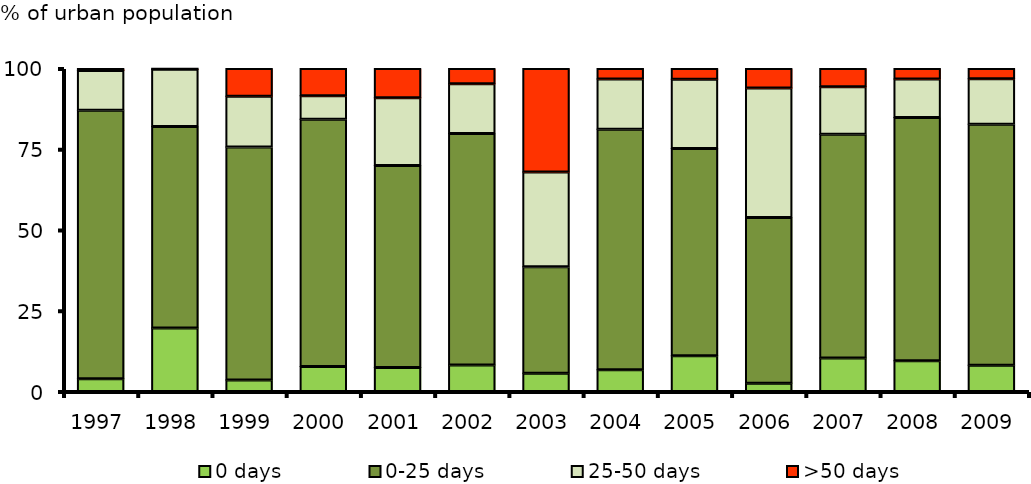
| Category | 0 days | 0-25 days | 25-50 days | >50 days |
|---|---|---|---|---|
| 1997.0 | 3.91 | 83.179 | 12.277 | 0.634 |
| 1998.0 | 19.625 | 62.437 | 17.68 | 0.258 |
| 1999.0 | 3.564 | 72.156 | 15.67 | 8.61 |
| 2000.0 | 7.735 | 76.584 | 7.252 | 8.43 |
| 2001.0 | 7.439 | 62.548 | 20.926 | 9.087 |
| 2002.0 | 8.177 | 71.715 | 15.366 | 4.742 |
| 2003.0 | 5.612 | 33.049 | 29.332 | 32.007 |
| 2004.0 | 6.725 | 74.486 | 15.522 | 3.267 |
| 2005.0 | 11.041 | 64.188 | 21.458 | 3.313 |
| 2006.0 | 2.523 | 51.336 | 40.14 | 6.001 |
| 2007.0 | 10.402 | 69.212 | 14.736 | 5.65 |
| 2008.0 | 9.483 | 75.375 | 11.894 | 3.248 |
| 2009.0 | 8.151 | 74.605 | 14.08 | 3.164 |